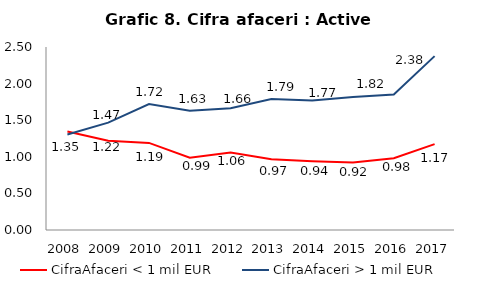
| Category | CifraAfaceri < 1 mil EUR | CifraAfaceri > 1 mil EUR |
|---|---|---|
| 2008.0 | 1.347 | 1.305 |
| 2009.0 | 1.218 | 1.467 |
| 2010.0 | 1.19 | 1.721 |
| 2011.0 | 0.986 | 1.628 |
| 2012.0 | 1.057 | 1.663 |
| 2013.0 | 0.968 | 1.788 |
| 2014.0 | 0.94 | 1.769 |
| 2015.0 | 0.921 | 1.817 |
| 2016.0 | 0.98 | 1.85 |
| 2017.0 | 1.173 | 2.375 |